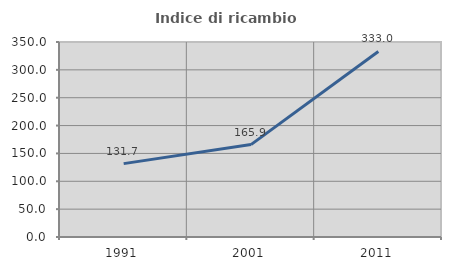
| Category | Indice di ricambio occupazionale  |
|---|---|
| 1991.0 | 131.723 |
| 2001.0 | 165.865 |
| 2011.0 | 333.038 |